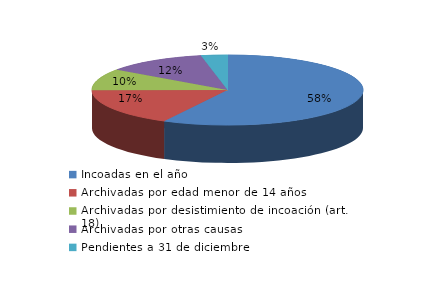
| Category | Series 0 |
|---|---|
| Incoadas en el año | 221 |
| Archivadas por edad menor de 14 años | 66 |
| Archivadas por desistimiento de incoación (art. 18) | 38 |
| Archivadas por otras causas | 46 |
| Pendientes a 31 de diciembre | 12 |